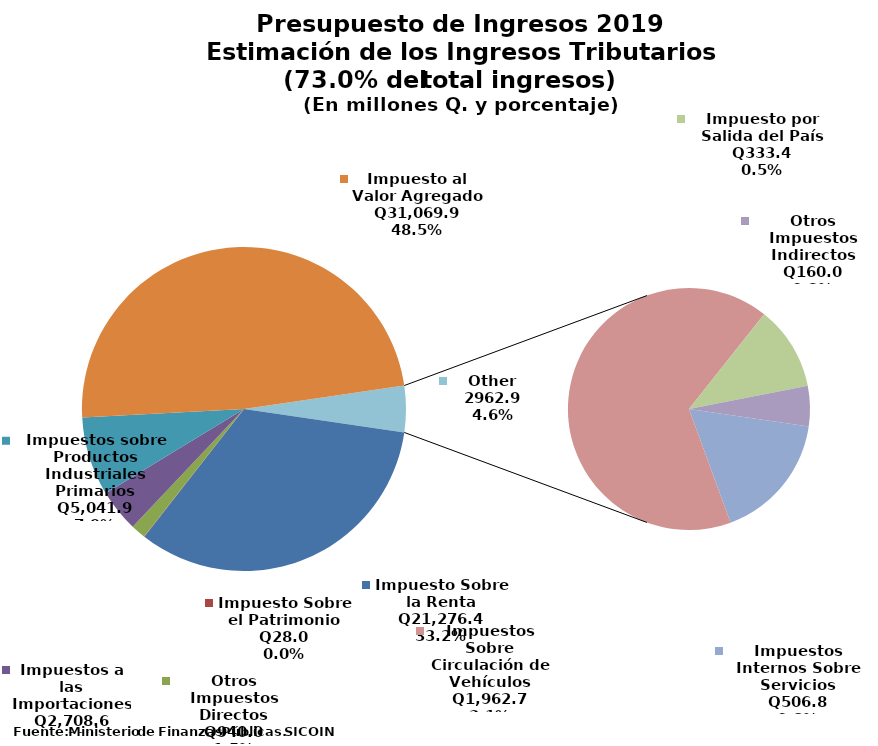
| Category | Aprobado 2017 |
|---|---|
| Impuesto Sobre la Renta | 21276.4 |
| Impuesto Sobre el Patrimonio | 28 |
| Otros Impuestos Directos | 940 |
| Impuestos a las Importaciones | 2708.6 |
| Impuestos sobre Productos Industriales Primarios | 5041.9 |
| Impuesto al Valor Agregado | 31069.9 |
| Impuestos Internos Sobre Servicios | 506.8 |
| Impuestos Sobre Circulación de Vehículos | 1962.7 |
| Impuesto por Salida del País | 333.4 |
| Otros Impuestos Indirectos | 160 |